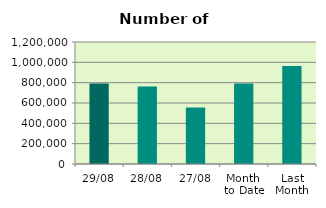
| Category | Series 0 |
|---|---|
| 29/08 | 791256 |
| 28/08 | 761912 |
| 27/08 | 555808 |
| Month 
to Date | 791579.429 |
| Last
Month | 964212.818 |